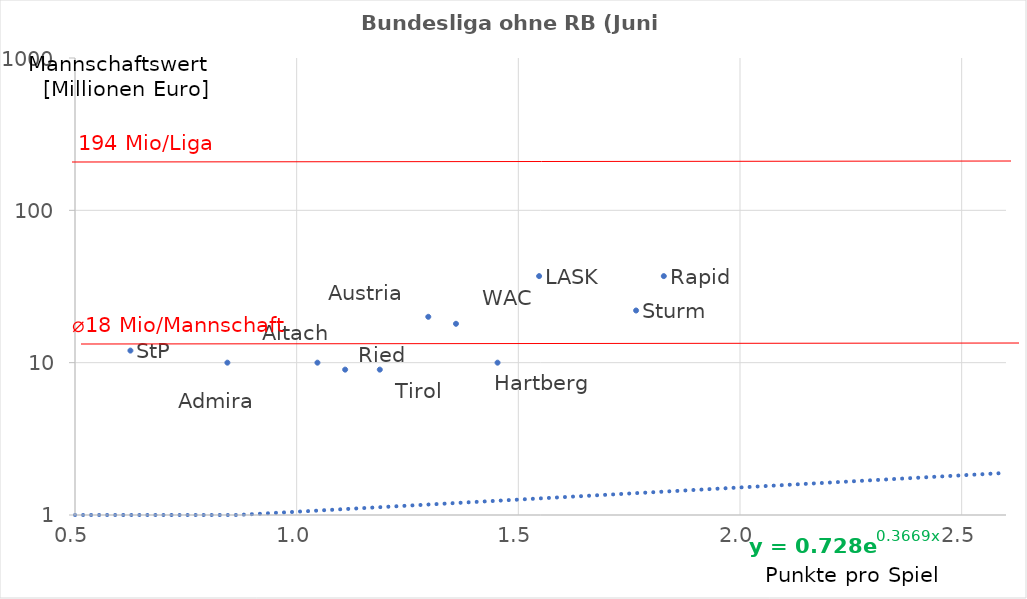
| Category | Series 0 |
|---|---|
| 1.828125 | 37 |
| 1.546875 | 37 |
| 1.765625 | 22 |
| 1.296875 | 20 |
| 1.359375 | 18 |
| 0.625 | 12 |
| 1.453125 | 10 |
| 1.046875 | 10 |
| 0.84375 | 10 |
| 1.1875 | 9 |
| 1.109375 | 9 |